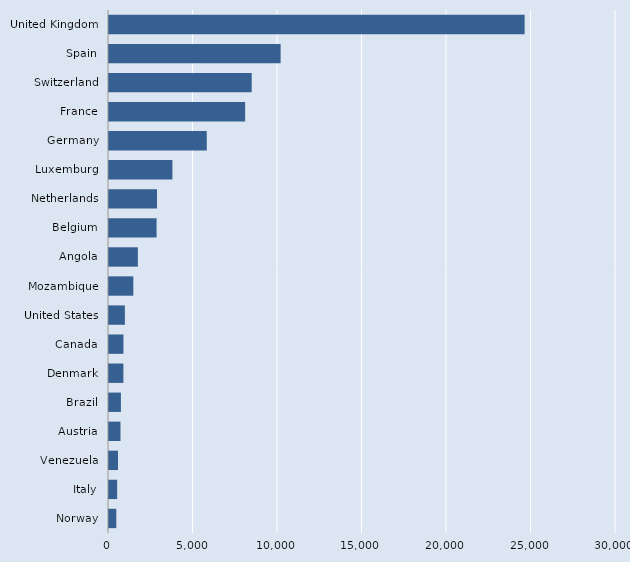
| Category | Series 0 |
|---|---|
| Norway | 432 |
| Italy | 484 |
| Venezuela | 532 |
| Austria | 680 |
| Brazil | 705 |
| Denmark | 852 |
| Canada | 855 |
| United States | 940 |
| Mozambique | 1439 |
| Angola | 1708 |
| Belgium | 2816 |
| Netherlands | 2841 |
| Luxemburg | 3752 |
| Germany | 5785 |
| France | 8055 |
| Switzerland | 8443 |
| Spain | 10155 |
| United Kingdom | 24593 |